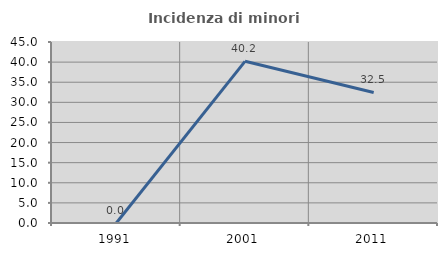
| Category | Incidenza di minori stranieri |
|---|---|
| 1991.0 | 0 |
| 2001.0 | 40.196 |
| 2011.0 | 32.461 |